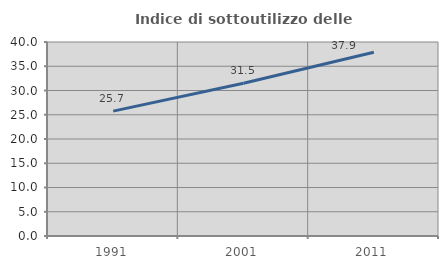
| Category | Indice di sottoutilizzo delle abitazioni  |
|---|---|
| 1991.0 | 25.745 |
| 2001.0 | 31.508 |
| 2011.0 | 37.89 |